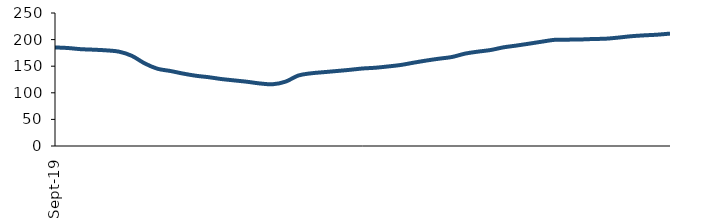
| Category | Series 0 |
|---|---|
| 2019-09-01 | 185.248 |
| 2019-10-01 | 184.195 |
| 2019-11-01 | 182.028 |
| 2019-12-01 | 181.044 |
| 2020-01-01 | 179.776 |
| 2020-02-01 | 177.328 |
| 2020-03-01 | 169.453 |
| 2020-04-01 | 155.277 |
| 2020-05-01 | 145.207 |
| 2020-06-01 | 141.034 |
| 2020-07-01 | 136.109 |
| 2020-08-01 | 132.034 |
| 2020-09-01 | 129.3 |
| 2020-10-01 | 125.829 |
| 2020-11-01 | 123.263 |
| 2020-12-01 | 120.707 |
| 2021-01-01 | 117.538 |
| 2021-02-01 | 116.084 |
| 2021-03-01 | 121.021 |
| 2021-04-01 | 132.55 |
| 2021-05-01 | 136.669 |
| 2021-06-01 | 138.833 |
| 2021-07-01 | 140.97 |
| 2021-08-01 | 143.159 |
| 2021-09-01 | 145.68 |
| 2021-10-01 | 147.105 |
| 2021-11-01 | 149.536 |
| 2021-12-01 | 152.367 |
| 2022-01-01 | 156.659 |
| 2022-02-01 | 160.695 |
| 2022-03-01 | 164.187 |
| 2022-04-01 | 167.372 |
| 2022-05-01 | 173.631 |
| 2022-06-01 | 177.334 |
| 2022-07-01 | 180.425 |
| 2022-08-01 | 185.427 |
| 2022-09-01 | 188.732 |
| 2022-10-01 | 192.332 |
| 2022-11-01 | 196.105 |
| 2022-12-01 | 199.604 |
| 2023-01-01 | 199.904 |
| 2023-02-01 | 200.222 |
| 2023-03-01 | 201.111 |
| 2023-04-01 | 201.711 |
| 2023-05-01 | 203.854 |
| 2023-06-01 | 206.402 |
| 2023-07-01 | 207.99 |
| 2023-08-01 | 209.236 |
| 2023-09-01 | 211.29 |